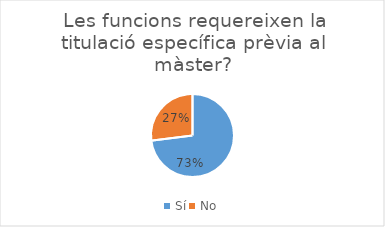
| Category | Series 0 |
|---|---|
| Sí | 46 |
| No | 17 |